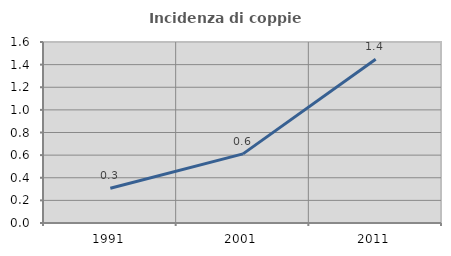
| Category | Incidenza di coppie miste |
|---|---|
| 1991.0 | 0.307 |
| 2001.0 | 0.611 |
| 2011.0 | 1.447 |